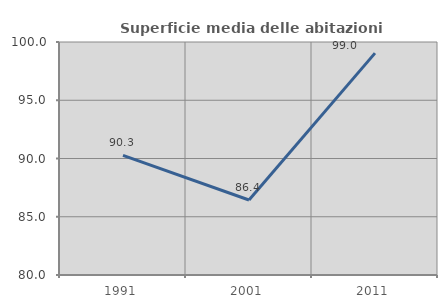
| Category | Superficie media delle abitazioni occupate |
|---|---|
| 1991.0 | 90.273 |
| 2001.0 | 86.438 |
| 2011.0 | 99.045 |